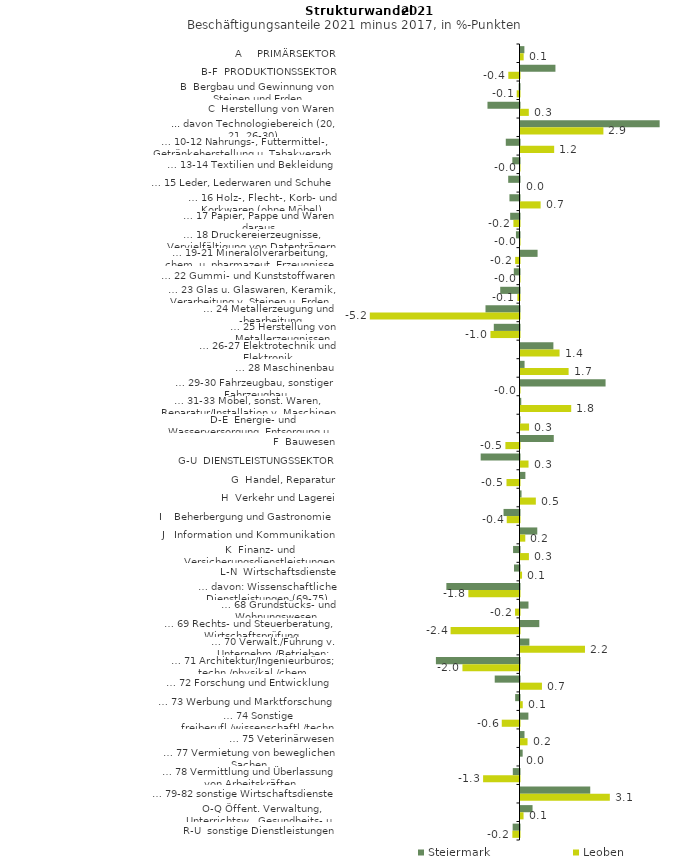
| Category | Steiermark | Leoben |
|---|---|---|
| A     PRIMÄRSEKTOR | 0.135 | 0.11 |
| B-F  PRODUKTIONSSEKTOR | 1.215 | -0.389 |
| B  Bergbau und Gewinnung von Steinen und Erden | -0.029 | -0.097 |
| C  Herstellung von Waren | -1.114 | 0.289 |
| ... davon Technologiebereich (20, 21, 26-30) | 4.84 | 2.883 |
| … 10-12 Nahrungs-, Futtermittel-, Getränkeherstellung u. Tabakverarb. | -0.477 | 1.171 |
| … 13-14 Textilien und Bekleidung | -0.249 | -0.003 |
| … 15 Leder, Lederwaren und Schuhe | -0.393 | 0 |
| … 16 Holz-, Flecht-, Korb- und Korkwaren (ohne Möbel)  | -0.35 | 0.7 |
| … 17 Papier, Pappe und Waren daraus  | -0.325 | -0.212 |
| … 18 Druckereierzeugnisse, Vervielfältigung von Datenträgern | -0.124 | -0.009 |
| … 19-21 Mineralölverarbeitung, chem. u. pharmazeut. Erzeugnisse | 0.594 | -0.151 |
| … 22 Gummi- und Kunststoffwaren | -0.198 | -0.004 |
| … 23 Glas u. Glaswaren, Keramik, Verarbeitung v. Steinen u. Erden  | -0.671 | -0.074 |
| … 24 Metallerzeugung und -bearbeitung | -1.183 | -5.206 |
| … 25 Herstellung von Metallerzeugnissen  | -0.894 | -1.01 |
| … 26-27 Elektrotechnik und Elektronik | 1.144 | 1.359 |
| … 28 Maschinenbau | 0.141 | 1.674 |
| … 29-30 Fahrzeugbau, sonstiger Fahrzeugbau | 2.959 | -0.015 |
| … 31-33 Möbel, sonst. Waren, Reparatur/Installation v. Maschinen | 0.026 | 1.764 |
| D-E  Energie- und Wasserversorgung, Entsorgung u. Rückgewinnung | -0.016 | 0.298 |
| F  Bauwesen | 1.158 | -0.49 |
| G-U  DIENSTLEISTUNGSSEKTOR | -1.351 | 0.279 |
| G  Handel, Reparatur | 0.17 | -0.452 |
| H  Verkehr und Lagerei | 0.036 | 0.534 |
| I    Beherbergung und Gastronomie | -0.556 | -0.444 |
| J   Information und Kommunikation | 0.584 | 0.166 |
| K  Finanz- und Versicherungsdienstleistungen | -0.224 | 0.293 |
| L-N  Wirtschaftsdienste | -0.191 | 0.054 |
| … davon: Wissenschaftliche Dienstleistungen (69-75) | -2.544 | -1.779 |
| … 68 Grundstücks- und Wohnungswesen  | 0.278 | -0.155 |
| … 69 Rechts- und Steuerberatung, Wirtschaftsprüfung | 0.654 | -2.396 |
| … 70 Verwalt./Führung v. Unternehm./Betrieben; Unternehmensberat. | 0.309 | 2.243 |
| … 71 Architektur/Ingenieurbüros; techn./physikal./chem. Untersuchung | -2.908 | -1.985 |
| … 72 Forschung und Entwicklung  | -0.862 | 0.746 |
| … 73 Werbung und Marktforschung | -0.151 | 0.078 |
| … 74 Sonstige freiberufl./wissenschaftl./techn. Tätigkeiten | 0.275 | -0.617 |
| … 75 Veterinärwesen | 0.139 | 0.245 |
| … 77 Vermietung von beweglichen Sachen  | 0.075 | 0 |
| … 78 Vermittlung und Überlassung von Arbeitskräften | -0.233 | -1.266 |
| … 79-82 sonstige Wirtschaftsdienste | 2.426 | 3.107 |
| O-Q Öffent. Verwaltung, Unterrichtsw., Gesundheits- u. Sozialwesen | 0.419 | 0.106 |
| R-U  sonstige Dienstleistungen | -0.238 | -0.249 |